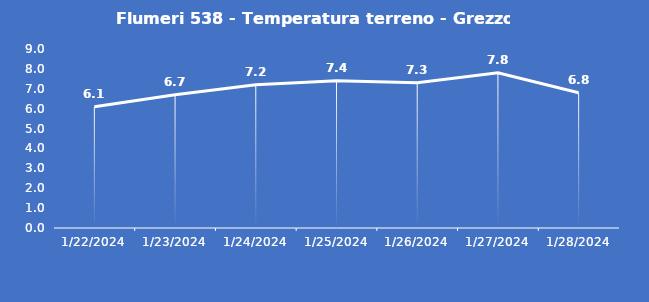
| Category | Flumeri 538 - Temperatura terreno - Grezzo (°C) |
|---|---|
| 1/22/24 | 6.1 |
| 1/23/24 | 6.7 |
| 1/24/24 | 7.2 |
| 1/25/24 | 7.4 |
| 1/26/24 | 7.3 |
| 1/27/24 | 7.8 |
| 1/28/24 | 6.8 |